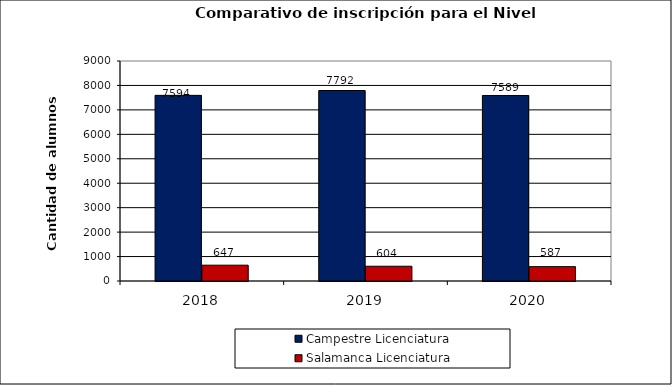
| Category | Campestre | Salamanca |
|---|---|---|
| 2018.0 | 7594 | 647 |
| 2019.0 | 7792 | 604 |
| 2020.0 | 7589 | 587 |